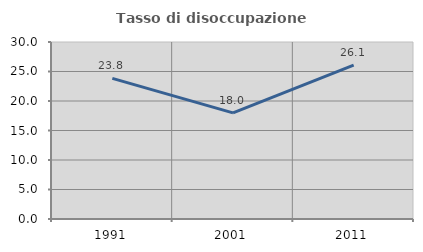
| Category | Tasso di disoccupazione giovanile  |
|---|---|
| 1991.0 | 23.828 |
| 2001.0 | 17.978 |
| 2011.0 | 26.071 |